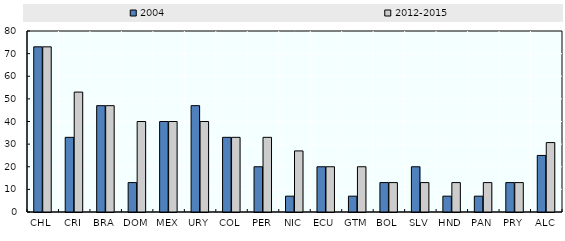
| Category | 2004 | 2012-2015 |
|---|---|---|
| CHL | 73 | 73 |
| CRI | 33 | 53 |
| BRA | 47 | 47 |
| DOM | 13 | 40 |
| MEX | 40 | 40 |
| URY | 47 | 40 |
| COL | 33 | 33 |
| PER | 20 | 33 |
| NIC | 7 | 27 |
| ECU | 20 | 20 |
| GTM | 7 | 20 |
| BOL | 13 | 13 |
| SLV | 20 | 13 |
| HND | 7 | 13 |
| PAN | 7 | 13 |
| PRY | 13 | 13 |
| ALC | 25 | 30.688 |